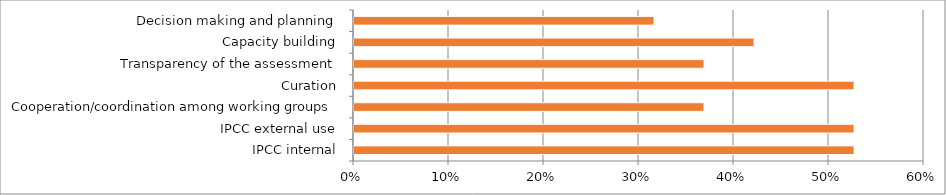
| Category | Series 0 |
|---|---|
| IPCC internal | 0.526 |
| IPCC external use | 0.526 |
| Cooperation/coordination among working groups | 0.368 |
| Curation | 0.526 |
| Transparency of the assessment | 0.368 |
| Capacity building | 0.421 |
| Decision making and planning | 0.316 |